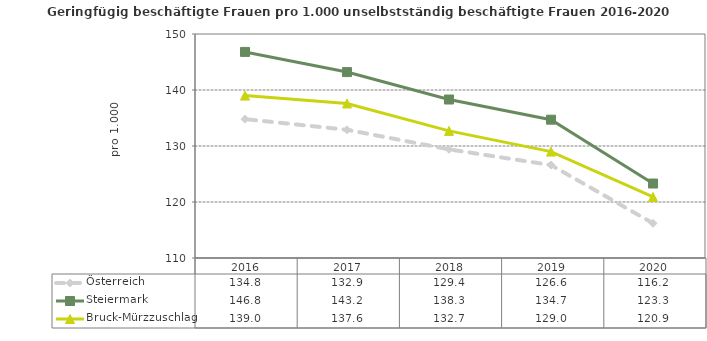
| Category | Österreich | Steiermark | Bruck-Mürzzuschlag |
|---|---|---|---|
| 2020.0 | 116.2 | 123.3 | 120.9 |
| 2019.0 | 126.6 | 134.7 | 129 |
| 2018.0 | 129.4 | 138.3 | 132.7 |
| 2017.0 | 132.9 | 143.2 | 137.6 |
| 2016.0 | 134.8 | 146.8 | 139 |